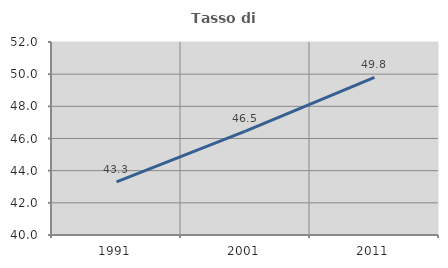
| Category | Tasso di occupazione   |
|---|---|
| 1991.0 | 43.308 |
| 2001.0 | 46.454 |
| 2011.0 | 49.798 |